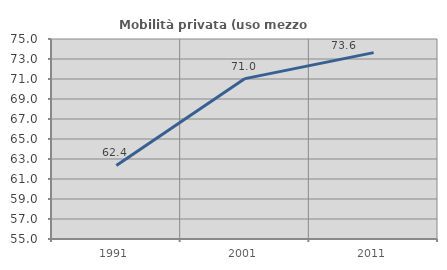
| Category | Mobilità privata (uso mezzo privato) |
|---|---|
| 1991.0 | 62.36 |
| 2001.0 | 71.04 |
| 2011.0 | 73.636 |